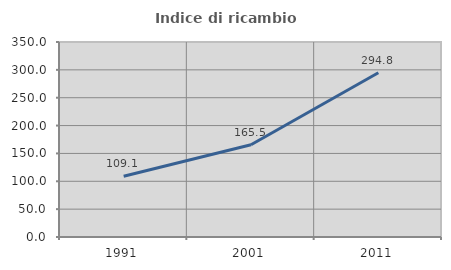
| Category | Indice di ricambio occupazionale  |
|---|---|
| 1991.0 | 109.091 |
| 2001.0 | 165.53 |
| 2011.0 | 294.845 |